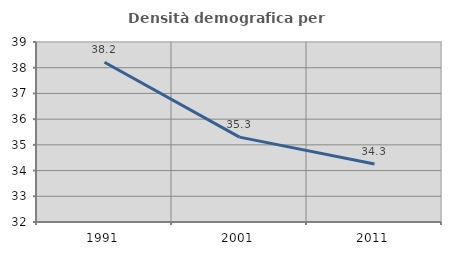
| Category | Densità demografica |
|---|---|
| 1991.0 | 38.212 |
| 2001.0 | 35.302 |
| 2011.0 | 34.259 |